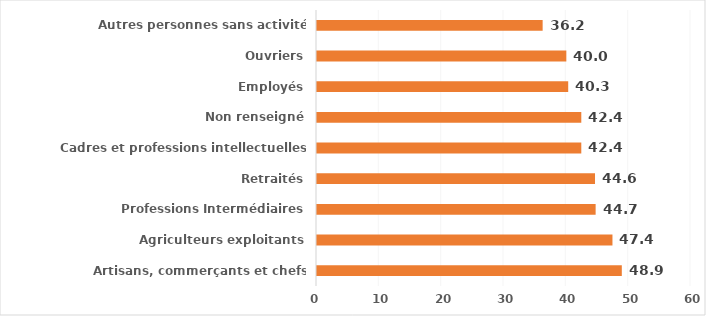
| Category | Series 0 |
|---|---|
| Artisans, commerçants et chefs d'entreprise | 48.9 |
| Agriculteurs exploitants | 47.4 |
| Professions Intermédiaires | 44.7 |
| Retraités | 44.6 |
| Cadres et professions intellectuelles supérieures | 42.4 |
| Non renseigné | 42.4 |
| Employés | 40.3 |
| Ouvriers | 40 |
| Autres personnes sans activité professionnelle | 36.2 |